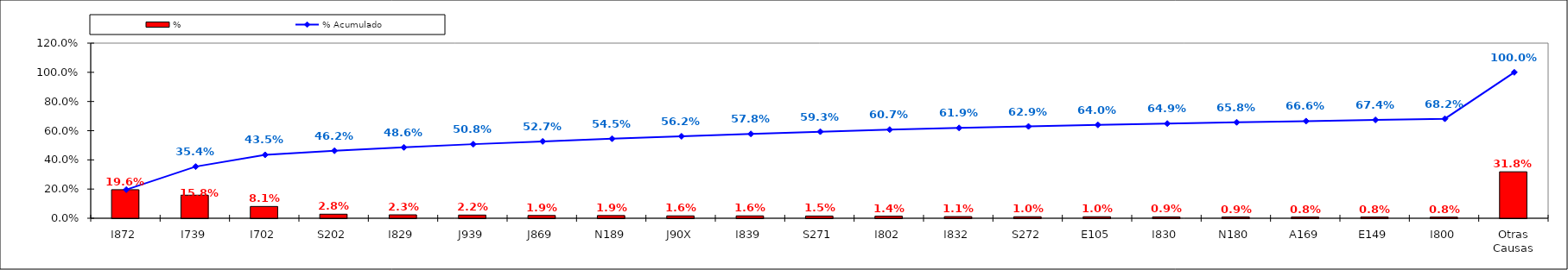
| Category | % |
|---|---|
| I872 | 0.196 |
| I739 | 0.158 |
| I702 | 0.081 |
| S202 | 0.028 |
| I829 | 0.023 |
| J939 | 0.022 |
| J869 | 0.019 |
| N189 | 0.019 |
| J90X | 0.016 |
| I839 | 0.016 |
| S271 | 0.015 |
| I802 | 0.014 |
| I832 | 0.011 |
| S272 | 0.01 |
| E105 | 0.01 |
| I830 | 0.009 |
| N180 | 0.009 |
| A169 | 0.008 |
| E149 | 0.008 |
| I800 | 0.008 |
| Otras Causas | 0.318 |